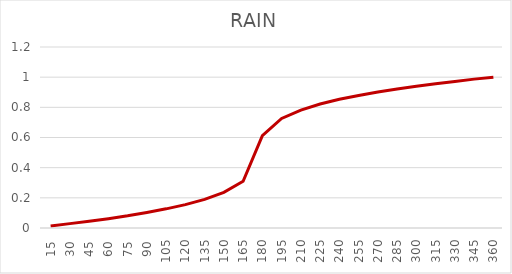
| Category | RAIN |
|---|---|
| 15.0 | 0.014 |
| 30.0 | 0.029 |
| 45.0 | 0.045 |
| 60.0 | 0.062 |
| 75.0 | 0.081 |
| 90.0 | 0.103 |
| 105.0 | 0.127 |
| 120.0 | 0.155 |
| 135.0 | 0.19 |
| 150.0 | 0.236 |
| 165.0 | 0.31 |
| 180.0 | 0.612 |
| 195.0 | 0.726 |
| 210.0 | 0.782 |
| 225.0 | 0.822 |
| 240.0 | 0.853 |
| 255.0 | 0.879 |
| 270.0 | 0.902 |
| 285.0 | 0.922 |
| 300.0 | 0.94 |
| 315.0 | 0.957 |
| 330.0 | 0.972 |
| 345.0 | 0.987 |
| 360.0 | 1 |